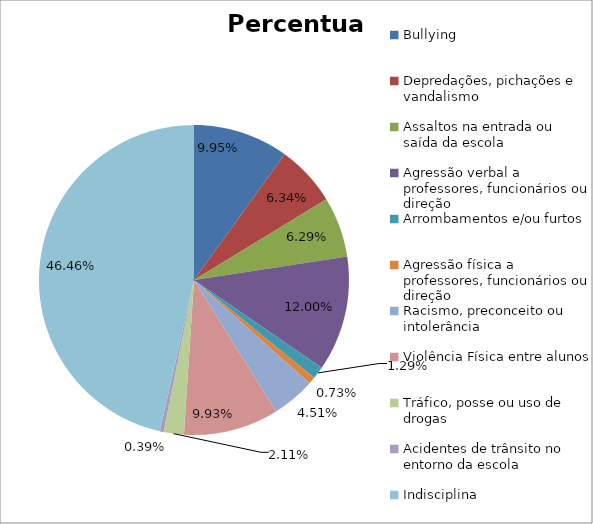
| Category | Percentual |
|---|---|
| Bullying | 0.1 |
| Depredações, pichações e vandalismo | 0.063 |
| Assaltos na entrada ou saída da escola | 0.063 |
| Agressão verbal a professores, funcionários ou direção | 0.12 |
| Arrombamentos e/ou furtos | 0.013 |
| Agressão física a professores, funcionários ou direção | 0.007 |
| Racismo, preconceito ou intolerância | 0.045 |
| Violência Física entre alunos | 0.099 |
| Tráfico, posse ou uso de drogas | 0.021 |
| Acidentes de trânsito no entorno da escola | 0.004 |
| Indisciplina | 0.465 |